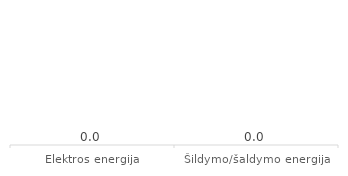
| Category | Series 0 |
|---|---|
| Elektros energija | 0 |
| Šildymo/šaldymo energija | 0 |